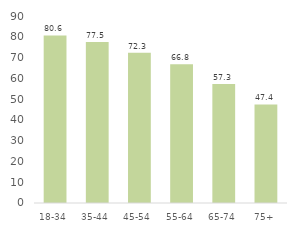
| Category | Series 0 |
|---|---|
| 18-34 | 80.629 |
| 35-44 | 77.532 |
| 45-54 | 72.316 |
| 55-64 | 66.791 |
| 65-74 | 57.324 |
| 75+ | 47.427 |